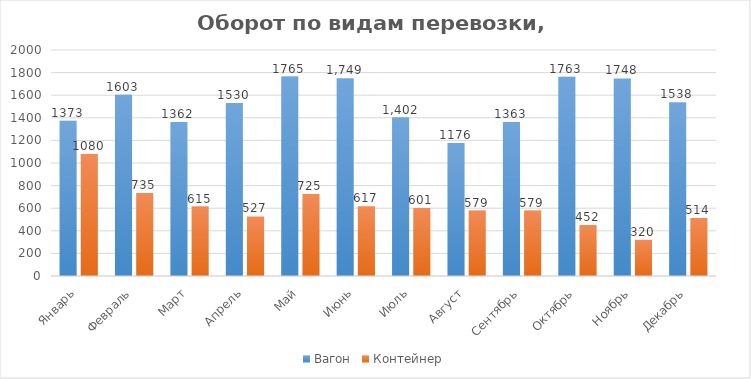
| Category | Вагон | Контейнер |
|---|---|---|
| Январь | 1373 | 1080 |
| Февраль | 1603 | 735 |
| Март | 1362 | 615 |
| Апрель | 1530 | 527 |
| Май | 1765 | 725 |
| Июнь | 1749 | 617 |
| Июль | 1402 | 601 |
| Август | 1176 | 579 |
| Сентябрь | 1363 | 579 |
| Октябрь | 1763 | 452 |
| Ноябрь | 1748 | 320 |
| Декабрь | 1538 | 514 |